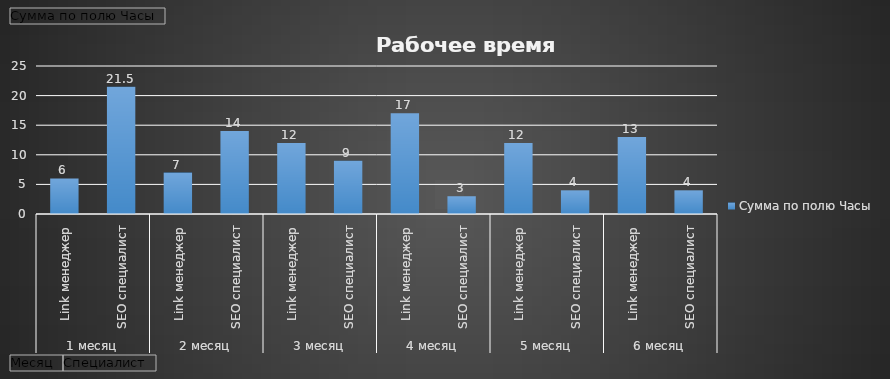
| Category | Итог |
|---|---|
| 0 | 6 |
| 1 | 21.5 |
| 2 | 7 |
| 3 | 14 |
| 4 | 12 |
| 5 | 9 |
| 6 | 17 |
| 7 | 3 |
| 8 | 12 |
| 9 | 4 |
| 10 | 13 |
| 11 | 4 |